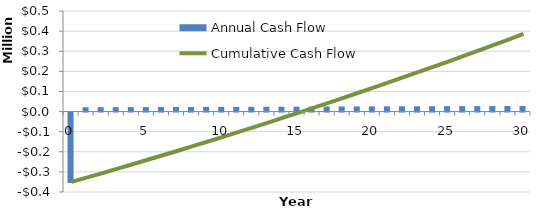
| Category | Annual Cash Flow |
|---|---|
| 0.0 | -350000 |
| 1.0 | 21393.74 |
| 2.0 | 21592.544 |
| 3.0 | 21793.427 |
| 4.0 | 21996.101 |
| 5.0 | 22200.583 |
| 6.0 | 22406.887 |
| 7.0 | 22615.027 |
| 8.0 | 22825.02 |
| 9.0 | 23036.88 |
| 10.0 | 23250.623 |
| 11.0 | 23466.264 |
| 12.0 | 23683.818 |
| 13.0 | 23903.301 |
| 14.0 | 24124.728 |
| 15.0 | 24348.117 |
| 16.0 | 24573.481 |
| 17.0 | 24800.838 |
| 18.0 | 25030.203 |
| 19.0 | 25261.594 |
| 20.0 | 25495.025 |
| 21.0 | 25730.513 |
| 22.0 | 25968.076 |
| 23.0 | 26207.729 |
| 24.0 | 26449.49 |
| 25.0 | 26693.374 |
| 26.0 | 26939.4 |
| 27.0 | 27187.584 |
| 28.0 | 27437.944 |
| 29.0 | 27690.496 |
| 30.0 | 27945.258 |